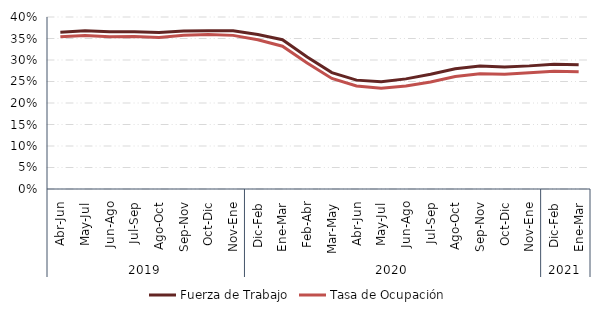
| Category | Fuerza de Trabajo | Tasa de Ocupación |
|---|---|---|
| 0 | 0.364 | 0.354 |
| 1 | 0.368 | 0.357 |
| 2 | 0.366 | 0.354 |
| 3 | 0.366 | 0.354 |
| 4 | 0.364 | 0.352 |
| 5 | 0.368 | 0.357 |
| 6 | 0.368 | 0.359 |
| 7 | 0.368 | 0.357 |
| 8 | 0.359 | 0.347 |
| 9 | 0.347 | 0.332 |
| 10 | 0.307 | 0.293 |
| 11 | 0.271 | 0.257 |
| 12 | 0.253 | 0.24 |
| 13 | 0.25 | 0.234 |
| 14 | 0.256 | 0.24 |
| 15 | 0.267 | 0.249 |
| 16 | 0.28 | 0.262 |
| 17 | 0.286 | 0.268 |
| 18 | 0.284 | 0.267 |
| 19 | 0.286 | 0.27 |
| 20 | 0.29 | 0.274 |
| 21 | 0.289 | 0.272 |